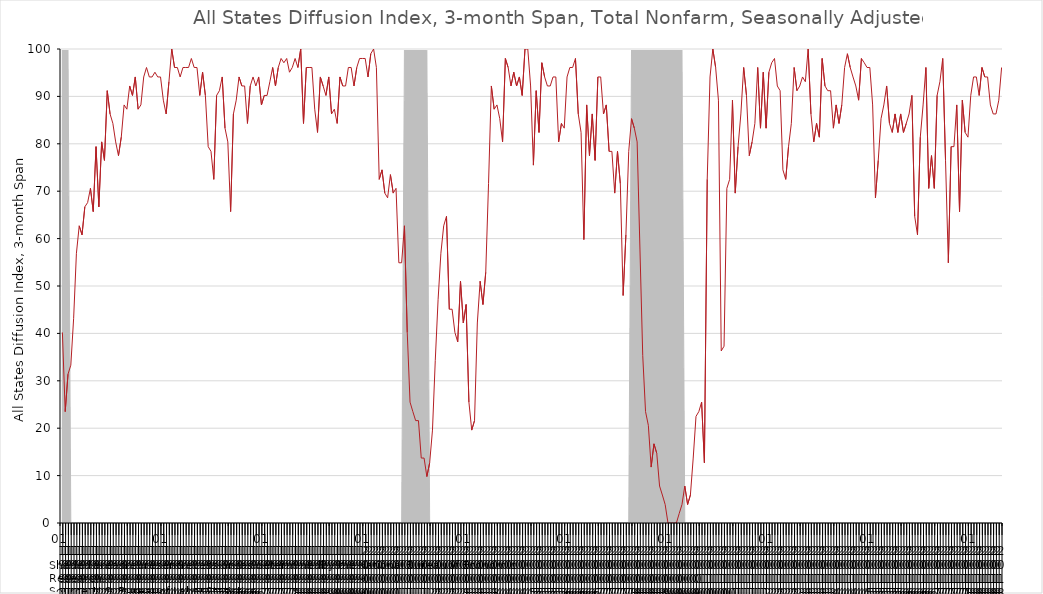
| Category | DI_3month |
|---|---|
| 1991 | 40.2 |
| 1991 | 23.5 |
| 1991 | 31.4 |
| 1991 | 33.3 |
| 1991 | 43.1 |
| 1991 | 56.9 |
| 1991 | 62.7 |
| 1991 | 60.8 |
| 1991 | 66.7 |
| 1991 | 67.6 |
| 1991 | 70.6 |
| 1991 | 65.7 |
| 1992 | 79.4 |
| 1992 | 66.7 |
| 1992 | 80.4 |
| 1992 | 76.5 |
| 1992 | 91.2 |
| 1992 | 86.3 |
| 1992 | 84.3 |
| 1992 | 80.4 |
| 1992 | 77.5 |
| 1992 | 81.4 |
| 1992 | 88.2 |
| 1992 | 87.3 |
| 1993 | 92.2 |
| 1993 | 90.2 |
| 1993 | 94.1 |
| 1993 | 87.3 |
| 1993 | 88.2 |
| 1993 | 94.1 |
| 1993 | 96.1 |
| 1993 | 94.1 |
| 1993 | 94.1 |
| 1993 | 95.1 |
| 1993 | 94.1 |
| 1993 | 94.1 |
| 1994 | 89.2 |
| 1994 | 86.3 |
| 1994 | 93.1 |
| 1994 | 100 |
| 1994 | 96.1 |
| 1994 | 96.1 |
| 1994 | 94.1 |
| 1994 | 96.1 |
| 1994 | 96.1 |
| 1994 | 96.1 |
| 1994 | 98 |
| 1994 | 96.1 |
| 1995 | 96.1 |
| 1995 | 90.2 |
| 1995 | 95.1 |
| 1995 | 90.2 |
| 1995 | 79.4 |
| 1995 | 78.4 |
| 1995 | 72.5 |
| 1995 | 90.2 |
| 1995 | 91.2 |
| 1995 | 94.1 |
| 1995 | 83.3 |
| 1995 | 80.4 |
| 1996 | 65.7 |
| 1996 | 86.3 |
| 1996 | 89.2 |
| 1996 | 94.1 |
| 1996 | 92.2 |
| 1996 | 92.2 |
| 1996 | 84.3 |
| 1996 | 92.2 |
| 1996 | 94.1 |
| 1996 | 92.2 |
| 1996 | 94.1 |
| 1996 | 88.2 |
| 1997 | 90.2 |
| 1997 | 90.2 |
| 1997 | 93.1 |
| 1997 | 96.1 |
| 1997 | 92.2 |
| 1997 | 96.1 |
| 1997 | 98 |
| 1997 | 97.1 |
| 1997 | 98 |
| 1997 | 95.1 |
| 1997 | 96.1 |
| 1997 | 98 |
| 1998 | 96.1 |
| 1998 | 100 |
| 1998 | 84.3 |
| 1998 | 96.1 |
| 1998 | 96.1 |
| 1998 | 96.1 |
| 1998 | 87.3 |
| 1998 | 82.4 |
| 1998 | 94.1 |
| 1998 | 92.2 |
| 1998 | 90.2 |
| 1998 | 94.1 |
| 1999 | 86.3 |
| 1999 | 87.3 |
| 1999 | 84.3 |
| 1999 | 94.1 |
| 1999 | 92.2 |
| 1999 | 92.2 |
| 1999 | 96.1 |
| 1999 | 96.1 |
| 1999 | 92.2 |
| 1999 | 96.1 |
| 1999 | 98 |
| 1999 | 98 |
| 2000 | 98 |
| 2000 | 94.1 |
| 2000 | 99 |
| 2000 | 100 |
| 2000 | 96.1 |
| 2000 | 72.5 |
| 2000 | 74.5 |
| 2000 | 69.6 |
| 2000 | 68.6 |
| 2000 | 73.5 |
| 2000 | 69.6 |
| 2000 | 70.6 |
| 2001 | 54.9 |
| 2001 | 54.9 |
| 2001 | 62.7 |
| 2001 | 40.2 |
| 2001 | 25.5 |
| 2001 | 23.5 |
| 2001 | 21.6 |
| 2001 | 21.6 |
| 2001 | 13.7 |
| 2001 | 13.7 |
| 2001 | 9.8 |
| 2001 | 12.7 |
| 2002 | 19.6 |
| 2002 | 34.3 |
| 2002 | 47.1 |
| 2002 | 56.9 |
| 2002 | 62.7 |
| 2002 | 64.7 |
| 2002 | 45.1 |
| 2002 | 45.1 |
| 2002 | 40.2 |
| 2002 | 38.2 |
| 2002 | 51 |
| 2002 | 42.2 |
| 2003 | 46.1 |
| 2003 | 25.5 |
| 2003 | 19.6 |
| 2003 | 21.6 |
| 2003 | 42.2 |
| 2003 | 51 |
| 2003 | 46.1 |
| 2003 | 52.9 |
| 2003 | 71.6 |
| 2003 | 92.2 |
| 2003 | 87.3 |
| 2003 | 88.2 |
| 2004 | 85.3 |
| 2004 | 80.4 |
| 2004 | 98 |
| 2004 | 96.1 |
| 2004 | 92.2 |
| 2004 | 95.1 |
| 2004 | 92.2 |
| 2004 | 94.1 |
| 2004 | 90.2 |
| 2004 | 100 |
| 2004 | 100 |
| 2004 | 92.2 |
| 2005 | 75.5 |
| 2005 | 91.2 |
| 2005 | 82.4 |
| 2005 | 97.1 |
| 2005 | 94.1 |
| 2005 | 92.2 |
| 2005 | 92.2 |
| 2005 | 94.1 |
| 2005 | 94.1 |
| 2005 | 80.4 |
| 2005 | 84.3 |
| 2005 | 83.3 |
| 2006 | 94.1 |
| 2006 | 96.1 |
| 2006 | 96.1 |
| 2006 | 98 |
| 2006 | 86.3 |
| 2006 | 82.4 |
| 2006 | 59.8 |
| 2006 | 88.2 |
| 2006 | 77.5 |
| 2006 | 86.3 |
| 2006 | 76.5 |
| 2006 | 94.1 |
| 2007 | 94.1 |
| 2007 | 86.3 |
| 2007 | 88.2 |
| 2007 | 78.4 |
| 2007 | 78.4 |
| 2007 | 69.6 |
| 2007 | 78.4 |
| 2007 | 71.6 |
| 2007 | 48 |
| 2007 | 60.8 |
| 2007 | 78.4 |
| 2007 | 85.3 |
| 2008 | 83.3 |
| 2008 | 80.4 |
| 2008 | 57.8 |
| 2008 | 35.3 |
| 2008 | 23.5 |
| 2008 | 20.6 |
| 2008 | 11.8 |
| 2008 | 16.7 |
| 2008 | 14.7 |
| 2008 | 7.8 |
| 2008 | 5.9 |
| 2008 | 3.9 |
| 2009 | 0 |
| 2009 | 0 |
| 2009 | 0 |
| 2009 | 0 |
| 2009 | 2 |
| 2009 | 3.9 |
| 2009 | 7.8 |
| 2009 | 3.9 |
| 2009 | 5.9 |
| 2009 | 13.7 |
| 2009 | 22.5 |
| 2009 | 23.5 |
| 2010 | 25.5 |
| 2010 | 12.7 |
| 2010 | 72.5 |
| 2010 | 94.1 |
| 2010 | 100 |
| 2010 | 96.1 |
| 2010 | 89.2 |
| 2010 | 36.3 |
| 2010 | 37.3 |
| 2010 | 70.6 |
| 2010 | 72.5 |
| 2010 | 89.2 |
| 2011 | 69.6 |
| 2011 | 79.4 |
| 2011 | 86.3 |
| 2011 | 96.1 |
| 2011 | 90.2 |
| 2011 | 77.5 |
| 2011 | 80.4 |
| 2011 | 84.3 |
| 2011 | 96.1 |
| 2011 | 83.3 |
| 2011 | 95.1 |
| 2011 | 83.3 |
| 2012 | 95.1 |
| 2012 | 97.1 |
| 2012 | 98 |
| 2012 | 92.2 |
| 2012 | 91.2 |
| 2012 | 74.5 |
| 2012 | 72.5 |
| 2012 | 79.4 |
| 2012 | 84.3 |
| 2012 | 96.1 |
| 2012 | 91.2 |
| 2012 | 92.2 |
| 2013 | 94.1 |
| 2013 | 93.1 |
| 2013 | 100 |
| 2013 | 86.3 |
| 2013 | 80.4 |
| 2013 | 84.3 |
| 2013 | 81.4 |
| 2013 | 98 |
| 2013 | 92.2 |
| 2013 | 91.2 |
| 2013 | 91.2 |
| 2013 | 83.3 |
| 2014 | 88.2 |
| 2014 | 84.3 |
| 2014 | 88.2 |
| 2014 | 96.1 |
| 2014 | 99 |
| 2014 | 96.1 |
| 2014 | 94.1 |
| 2014 | 92.2 |
| 2014 | 89.2 |
| 2014 | 98 |
| 2014 | 97.1 |
| 2014 | 96.1 |
| 2015 | 96.1 |
| 2015 | 88.2 |
| 2015 | 68.6 |
| 2015 | 76.5 |
| 2015 | 85.3 |
| 2015 | 88.2 |
| 2015 | 92.2 |
| 2015 | 84.3 |
| 2015 | 82.4 |
| 2015 | 86.3 |
| 2015 | 82.4 |
| 2015 | 86.3 |
| 2016 | 82.4 |
| 2016 | 84.3 |
| 2016 | 86.3 |
| 2016 | 90.2 |
| 2016 | 64.7 |
| 2016 | 60.8 |
| 2016 | 81.4 |
| 2016 | 88.2 |
| 2016 | 96.1 |
| 2016 | 70.6 |
| 2016 | 77.5 |
| 2016 | 70.6 |
| 2017 | 90.2 |
| 2017 | 93.1 |
| 2017 | 98 |
| 2017 | 76.5 |
| 2017 | 54.9 |
| 2017 | 79.4 |
| 2017 | 79.4 |
| 2017 | 88.2 |
| 2017 | 65.7 |
| 2017 | 89.2 |
| 2017 | 82.4 |
| 2017 | 81.4 |
| 2018 | 90.2 |
| 2018 | 94.1 |
| 2018 | 94.1 |
| 2018 | 90.2 |
| 2018 | 96.1 |
| 2018 | 94.1 |
| 2018 | 94.1 |
| 2018 | 88.2 |
| 2018 | 86.3 |